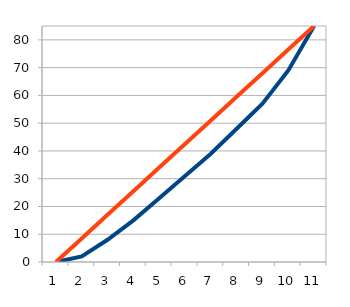
| Category | Series 0 | Series 1 |
|---|---|---|
| 0 | 0 | 0 |
| 1 | 2 | 8.5 |
| 2 | 8 | 17 |
| 3 | 15 | 25.5 |
| 4 | 23 | 34 |
| 5 | 31 | 42.5 |
| 6 | 39 | 51 |
| 7 | 48 | 59.5 |
| 8 | 57 | 68 |
| 9 | 69 | 76.5 |
| 10 | 85 | 85 |